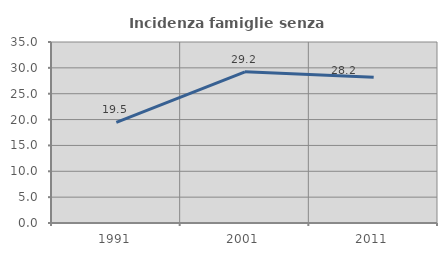
| Category | Incidenza famiglie senza nuclei |
|---|---|
| 1991.0 | 19.463 |
| 2001.0 | 29.24 |
| 2011.0 | 28.161 |